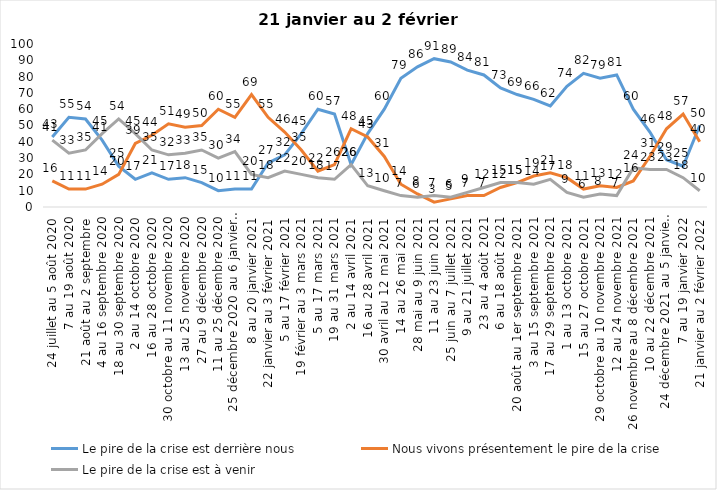
| Category | Le pire de la crise est derrière nous | Nous vivons présentement le pire de la crise | Le pire de la crise est à venir |
|---|---|---|---|
| 24 juillet au 5 août 2020 | 43 | 16 | 41 |
| 7 au 19 août 2020 | 55 | 11 | 33 |
| 21 août au 2 septembre | 54 | 11 | 35 |
| 4 au 16 septembre 2020 | 41 | 14 | 45 |
| 18 au 30 septembre 2020 | 25 | 20 | 54 |
| 2 au 14 octobre 2020 | 17 | 39 | 45 |
| 16 au 28 octobre 2020 | 21 | 44 | 35 |
| 30 octobre au 11 novembre 2020 | 17 | 51 | 32 |
| 13 au 25 novembre 2020 | 18 | 49 | 33 |
| 27 au 9 décembre 2020 | 15 | 50 | 35 |
| 11 au 25 décembre 2020 | 10 | 60 | 30 |
| 25 décembre 2020 au 6 janvier  2021 | 11 | 55 | 34 |
| 8 au 20 janvier 2021 | 11 | 69 | 20 |
| 22 janvier au 3 février 2021 | 27 | 55 | 18 |
| 5 au 17 février 2021 | 32 | 46 | 22 |
| 19 février au 3 mars 2021 | 45 | 35 | 20 |
| 5 au 17 mars 2021 | 60 | 22 | 18 |
| 19 au 31 mars 2021 | 57 | 26 | 17 |
| 2 au 14 avril 2021 | 26 | 48 | 26 |
| 16 au 28 avril 2021 | 45 | 43 | 13 |
| 30 avril au 12 mai 2021 | 60 | 31 | 10 |
| 14 au 26 mai 2021 | 79 | 14 | 7 |
| 28 mai au 9 juin 2021 | 86 | 8 | 6 |
| 11 au 23 juin 2021 | 91 | 3 | 7 |
| 25 juin au 7 juillet 2021 | 89 | 5 | 6 |
| 9 au 21 juillet 2021 | 84 | 7 | 9 |
| 23 au 4 août 2021 | 81 | 7 | 12 |
| 6 au 18 août 2021 | 73 | 12 | 15 |
| 20 août au 1er septembre 2021 | 69 | 15 | 15 |
| 3 au 15 septembre 2021 | 66 | 19 | 14 |
| 17 au 29 septembre 2021 | 62 | 21 | 17 |
| 1 au 13 octobre 2021 | 74 | 18 | 9 |
| 15 au 27 octobre 2021 | 82 | 11 | 6 |
| 29 octobre au 10 novembre 2021 | 79 | 13 | 8 |
| 12 au 24 novembre 2021 | 81 | 12 | 7 |
| 26 novembre au 8 décembre 2021 | 60 | 16 | 24 |
| 10 au 22 décembre 2021 | 46 | 31 | 23 |
| 24 décembre 2021 au 5 janvier 2022 | 29 | 48 | 23 |
| 7 au 19 janvier 2022 | 25 | 57 | 18 |
| 21 janvier au 2 février 2022 | 50 | 40 | 10 |